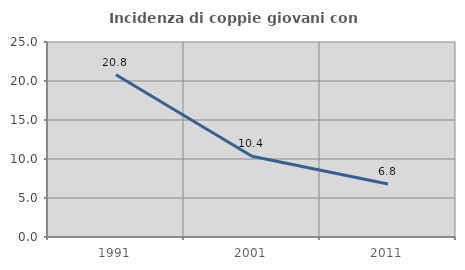
| Category | Incidenza di coppie giovani con figli |
|---|---|
| 1991.0 | 20.805 |
| 2001.0 | 10.356 |
| 2011.0 | 6.803 |